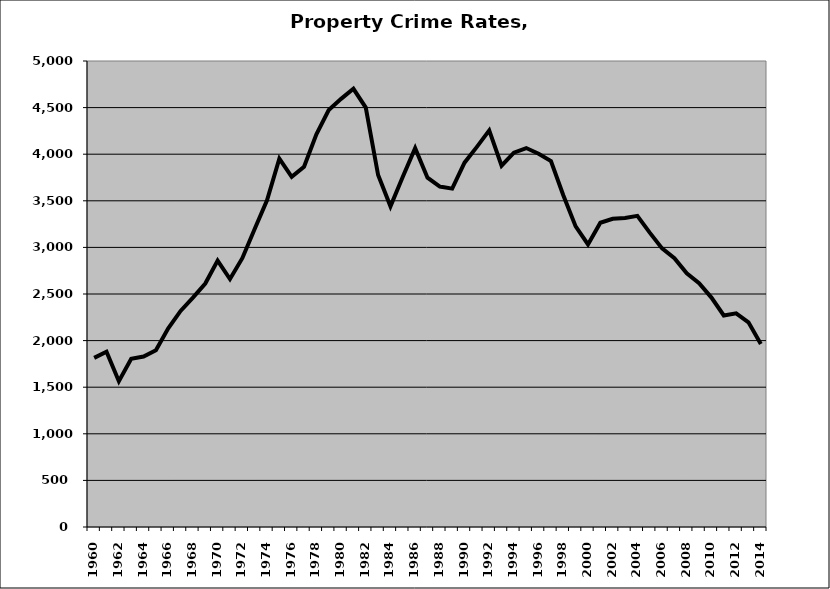
| Category | Property |
|---|---|
| 1960.0 | 1814.486 |
| 1961.0 | 1881.065 |
| 1962.0 | 1564.658 |
| 1963.0 | 1804.451 |
| 1964.0 | 1828.571 |
| 1965.0 | 1897.059 |
| 1966.0 | 2132.523 |
| 1967.0 | 2318.73 |
| 1968.0 | 2461.587 |
| 1969.0 | 2612.188 |
| 1970.0 | 2859.068 |
| 1971.0 | 2660 |
| 1972.0 | 2884.058 |
| 1973.0 | 3196.884 |
| 1974.0 | 3505.85 |
| 1975.0 | 3951.604 |
| 1976.0 | 3756.923 |
| 1977.0 | 3865.764 |
| 1978.0 | 4214.151 |
| 1979.0 | 4473.111 |
| 1980.0 | 4593.841 |
| 1981.0 | 4701.829 |
| 1982.0 | 4499.801 |
| 1983.0 | 3776.654 |
| 1984.0 | 3440.705 |
| 1985.0 | 3758.35 |
| 1986.0 | 4064.103 |
| 1987.0 | 3748.163 |
| 1988.0 | 3653.079 |
| 1989.0 | 3630.737 |
| 1990.0 | 3909.274 |
| 1991.0 | 4078.696 |
| 1992.0 | 4255.579 |
| 1993.0 | 3876.809 |
| 1994.0 | 4017.227 |
| 1995.0 | 4066.042 |
| 1996.0 | 4004.366 |
| 1997.0 | 3925.625 |
| 1998.0 | 3560.083 |
| 1999.0 | 3225.174 |
| 2000.0 | 3031.5 |
| 2001.0 | 3264.784 |
| 2002.0 | 3306.537 |
| 2003.0 | 3315.602 |
| 2004.0 | 3338.493 |
| 2005.0 | 3158.424 |
| 2006.0 | 2989.103 |
| 2007.0 | 2883.155 |
| 2008.0 | 2722.611 |
| 2009.0 | 2616.9 |
| 2010.0 | 2461.561 |
| 2011.0 | 2269.827 |
| 2012.0 | 2292.994 |
| 2013.0 | 2196.244 |
| 2014.0 | 1964.725 |